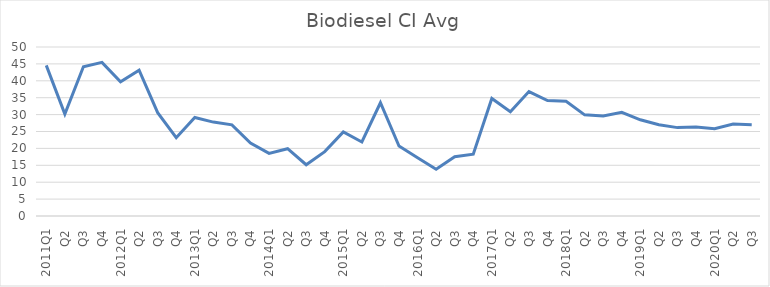
| Category | Series 0 |
|---|---|
| 2011Q1 | 44.57 |
| Q2 | 30.14 |
| Q3 | 44.16 |
| Q4 | 45.45 |
| 2012Q1 | 39.68 |
| Q2 | 43.15 |
| Q3 | 30.58 |
| Q4 | 23.16 |
| 2013Q1 | 29.14 |
| Q2 | 27.78 |
| Q3 | 26.97 |
| Q4 | 21.59 |
| 2014Q1 | 18.52 |
| Q2 | 19.91 |
| Q3 | 15.16 |
| Q4 | 19.04 |
| 2015Q1 | 24.88 |
| Q2 | 21.9 |
| Q3 | 33.51 |
| Q4 | 20.7 |
| 2016Q1 | 17.25 |
| Q2 | 13.83 |
| Q3 | 17.53 |
| Q4 | 18.31 |
| 2017Q1 | 34.76 |
| Q2 | 30.84 |
| Q3 | 36.82 |
| Q4 | 34.15 |
| 2018Q1 | 33.97 |
| Q2 | 29.93 |
| Q3 | 29.61 |
| Q4 | 30.67 |
| 2019Q1 | 28.46 |
| Q2 | 26.98 |
| Q3 | 26.15 |
| Q4 | 26.34 |
| 2020Q1 | 25.84 |
| Q2 | 27.23 |
| Q3 | 27.01 |